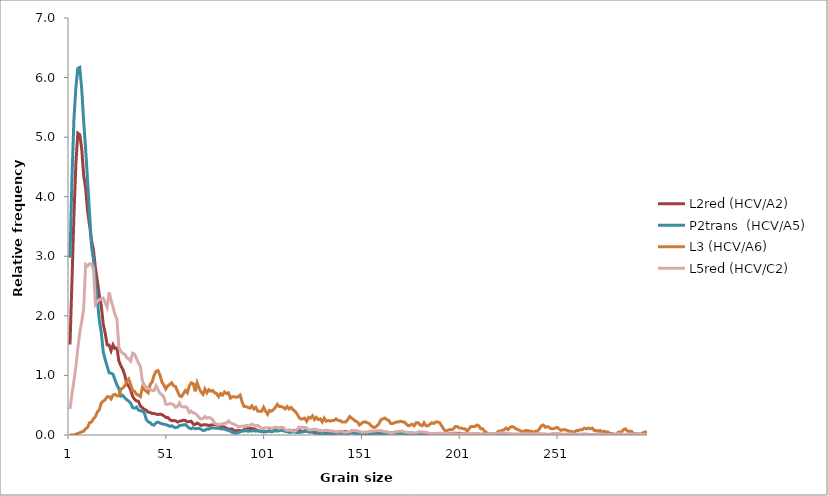
| Category | L2red (HCV/A2)  | P2trans  (HCV/A5) | L3 (HCV/A6) | L5red (HCV/C2) |
|---|---|---|---|---|
| 0 | 1.518 | 2.975 | 0 | 0.437 |
| 1 | 2.56 | 4.295 | 0 | 0.682 |
| 2 | 3.662 | 5.286 | 0 | 0.905 |
| 3 | 4.538 | 5.826 | 0.013 | 1.142 |
| 4 | 5.067 | 6.153 | 0.026 | 1.448 |
| 5 | 5.041 | 6.171 | 0.039 | 1.725 |
| 6 | 4.807 | 5.804 | 0.052 | 1.906 |
| 7 | 4.36 | 5.264 | 0.064 | 2.118 |
| 8 | 4.143 | 4.803 | 0.103 | 2.863 |
| 9 | 3.761 | 4.27 | 0.129 | 2.839 |
| 10 | 3.523 | 3.722 | 0.206 | 2.873 |
| 11 | 3.271 | 3.174 | 0.219 | 2.873 |
| 12 | 3.106 | 2.942 | 0.27 | 2.79 |
| 13 | 2.807 | 2.536 | 0.309 | 2.199 |
| 14 | 2.581 | 2.264 | 0.386 | 2.248 |
| 15 | 2.343 | 1.923 | 0.425 | 2.264 |
| 16 | 2.169 | 1.72 | 0.541 | 2.285 |
| 17 | 1.861 | 1.397 | 0.567 | 2.298 |
| 18 | 1.709 | 1.266 | 0.592 | 2.22 |
| 19 | 1.514 | 1.154 | 0.644 | 2.144 |
| 20 | 1.51 | 1.045 | 0.644 | 2.392 |
| 21 | 1.414 | 1.038 | 0.605 | 2.254 |
| 22 | 1.514 | 1.019 | 0.67 | 2.152 |
| 23 | 1.453 | 0.929 | 0.683 | 2.024 |
| 24 | 1.462 | 0.838 | 0.657 | 1.948 |
| 25 | 1.241 | 0.78 | 0.657 | 1.472 |
| 26 | 1.163 | 0.653 | 0.773 | 1.404 |
| 27 | 1.102 | 0.664 | 0.786 | 1.37 |
| 28 | 1.007 | 0.624 | 0.824 | 1.357 |
| 29 | 0.863 | 0.591 | 0.901 | 1.299 |
| 30 | 0.82 | 0.57 | 0.94 | 1.281 |
| 31 | 0.759 | 0.537 | 0.85 | 1.242 |
| 32 | 0.651 | 0.461 | 0.747 | 1.373 |
| 33 | 0.599 | 0.45 | 0.734 | 1.357 |
| 34 | 0.573 | 0.468 | 0.683 | 1.286 |
| 35 | 0.564 | 0.421 | 0.67 | 1.208 |
| 36 | 0.486 | 0.406 | 0.644 | 1.15 |
| 37 | 0.46 | 0.403 | 0.798 | 0.912 |
| 38 | 0.43 | 0.374 | 0.76 | 0.831 |
| 39 | 0.416 | 0.261 | 0.734 | 0.803 |
| 40 | 0.382 | 0.221 | 0.708 | 0.784 |
| 41 | 0.377 | 0.207 | 0.85 | 0.766 |
| 42 | 0.36 | 0.174 | 0.889 | 0.748 |
| 43 | 0.36 | 0.167 | 1.005 | 0.745 |
| 44 | 0.351 | 0.203 | 1.069 | 0.824 |
| 45 | 0.343 | 0.218 | 1.082 | 0.763 |
| 46 | 0.351 | 0.2 | 1.005 | 0.701 |
| 47 | 0.343 | 0.189 | 0.889 | 0.677 |
| 48 | 0.321 | 0.181 | 0.837 | 0.635 |
| 49 | 0.295 | 0.174 | 0.773 | 0.515 |
| 50 | 0.295 | 0.163 | 0.824 | 0.512 |
| 51 | 0.26 | 0.145 | 0.85 | 0.528 |
| 52 | 0.239 | 0.156 | 0.876 | 0.523 |
| 53 | 0.243 | 0.134 | 0.824 | 0.507 |
| 54 | 0.239 | 0.123 | 0.811 | 0.465 |
| 55 | 0.217 | 0.131 | 0.734 | 0.484 |
| 56 | 0.23 | 0.16 | 0.657 | 0.536 |
| 57 | 0.239 | 0.163 | 0.644 | 0.476 |
| 58 | 0.247 | 0.171 | 0.695 | 0.471 |
| 59 | 0.243 | 0.174 | 0.747 | 0.473 |
| 60 | 0.221 | 0.145 | 0.708 | 0.455 |
| 61 | 0.226 | 0.116 | 0.824 | 0.376 |
| 62 | 0.23 | 0.105 | 0.876 | 0.4 |
| 63 | 0.182 | 0.123 | 0.863 | 0.371 |
| 64 | 0.178 | 0.105 | 0.734 | 0.363 |
| 65 | 0.2 | 0.109 | 0.876 | 0.335 |
| 66 | 0.182 | 0.112 | 0.786 | 0.293 |
| 67 | 0.161 | 0.094 | 0.721 | 0.269 |
| 68 | 0.169 | 0.076 | 0.683 | 0.277 |
| 69 | 0.174 | 0.08 | 0.773 | 0.311 |
| 70 | 0.169 | 0.102 | 0.708 | 0.282 |
| 71 | 0.156 | 0.098 | 0.76 | 0.293 |
| 72 | 0.169 | 0.116 | 0.734 | 0.282 |
| 73 | 0.169 | 0.116 | 0.747 | 0.254 |
| 74 | 0.178 | 0.116 | 0.708 | 0.193 |
| 75 | 0.169 | 0.112 | 0.695 | 0.186 |
| 76 | 0.161 | 0.112 | 0.644 | 0.167 |
| 77 | 0.139 | 0.105 | 0.695 | 0.183 |
| 78 | 0.139 | 0.102 | 0.67 | 0.186 |
| 79 | 0.134 | 0.098 | 0.721 | 0.199 |
| 80 | 0.113 | 0.083 | 0.695 | 0.199 |
| 81 | 0.1 | 0.08 | 0.708 | 0.235 |
| 82 | 0.1 | 0.062 | 0.618 | 0.207 |
| 83 | 0.1 | 0.044 | 0.644 | 0.193 |
| 84 | 0.074 | 0.036 | 0.644 | 0.178 |
| 85 | 0.069 | 0.029 | 0.631 | 0.165 |
| 86 | 0.078 | 0.04 | 0.644 | 0.136 |
| 87 | 0.074 | 0.054 | 0.67 | 0.144 |
| 88 | 0.069 | 0.069 | 0.554 | 0.146 |
| 89 | 0.091 | 0.065 | 0.476 | 0.144 |
| 90 | 0.1 | 0.08 | 0.476 | 0.165 |
| 91 | 0.113 | 0.062 | 0.464 | 0.152 |
| 92 | 0.108 | 0.069 | 0.451 | 0.159 |
| 93 | 0.108 | 0.065 | 0.489 | 0.183 |
| 94 | 0.104 | 0.076 | 0.438 | 0.167 |
| 95 | 0.091 | 0.065 | 0.464 | 0.152 |
| 96 | 0.074 | 0.073 | 0.399 | 0.159 |
| 97 | 0.065 | 0.062 | 0.399 | 0.139 |
| 98 | 0.056 | 0.062 | 0.399 | 0.112 |
| 99 | 0.052 | 0.054 | 0.464 | 0.107 |
| 100 | 0.056 | 0.054 | 0.399 | 0.123 |
| 101 | 0.061 | 0.058 | 0.348 | 0.12 |
| 102 | 0.074 | 0.065 | 0.412 | 0.123 |
| 103 | 0.078 | 0.054 | 0.399 | 0.105 |
| 104 | 0.087 | 0.062 | 0.425 | 0.12 |
| 105 | 0.108 | 0.073 | 0.464 | 0.133 |
| 106 | 0.113 | 0.065 | 0.515 | 0.12 |
| 107 | 0.113 | 0.073 | 0.476 | 0.112 |
| 108 | 0.121 | 0.08 | 0.476 | 0.123 |
| 109 | 0.1 | 0.073 | 0.464 | 0.125 |
| 110 | 0.074 | 0.058 | 0.438 | 0.089 |
| 111 | 0.069 | 0.058 | 0.476 | 0.078 |
| 112 | 0.082 | 0.044 | 0.438 | 0.081 |
| 113 | 0.065 | 0.047 | 0.464 | 0.078 |
| 114 | 0.074 | 0.051 | 0.425 | 0.068 |
| 115 | 0.078 | 0.051 | 0.399 | 0.068 |
| 116 | 0.069 | 0.044 | 0.361 | 0.086 |
| 117 | 0.069 | 0.04 | 0.296 | 0.131 |
| 118 | 0.069 | 0.047 | 0.27 | 0.131 |
| 119 | 0.056 | 0.051 | 0.27 | 0.125 |
| 120 | 0.069 | 0.058 | 0.283 | 0.128 |
| 121 | 0.069 | 0.062 | 0.232 | 0.12 |
| 122 | 0.052 | 0.065 | 0.296 | 0.086 |
| 123 | 0.048 | 0.058 | 0.283 | 0.086 |
| 124 | 0.052 | 0.054 | 0.322 | 0.092 |
| 125 | 0.035 | 0.054 | 0.258 | 0.097 |
| 126 | 0.035 | 0.051 | 0.296 | 0.094 |
| 127 | 0.026 | 0.04 | 0.258 | 0.078 |
| 128 | 0.035 | 0.029 | 0.27 | 0.081 |
| 129 | 0.026 | 0.025 | 0.219 | 0.068 |
| 130 | 0.03 | 0.015 | 0.283 | 0.076 |
| 131 | 0.03 | 0.022 | 0.232 | 0.081 |
| 132 | 0.026 | 0.033 | 0.245 | 0.078 |
| 133 | 0.022 | 0.036 | 0.232 | 0.065 |
| 134 | 0.03 | 0.04 | 0.245 | 0.073 |
| 135 | 0.026 | 0.04 | 0.245 | 0.06 |
| 136 | 0.03 | 0.04 | 0.27 | 0.055 |
| 137 | 0.048 | 0.033 | 0.245 | 0.055 |
| 138 | 0.052 | 0.033 | 0.245 | 0.065 |
| 139 | 0.052 | 0.025 | 0.219 | 0.055 |
| 140 | 0.056 | 0.029 | 0.219 | 0.05 |
| 141 | 0.061 | 0.025 | 0.219 | 0.044 |
| 142 | 0.043 | 0.025 | 0.258 | 0.055 |
| 143 | 0.043 | 0.029 | 0.309 | 0.052 |
| 144 | 0.048 | 0.033 | 0.283 | 0.076 |
| 145 | 0.043 | 0.033 | 0.258 | 0.076 |
| 146 | 0.03 | 0.033 | 0.232 | 0.073 |
| 147 | 0.039 | 0.029 | 0.219 | 0.065 |
| 148 | 0.03 | 0.025 | 0.167 | 0.06 |
| 149 | 0.026 | 0.029 | 0.193 | 0.05 |
| 150 | 0.022 | 0.029 | 0.219 | 0.044 |
| 151 | 0.026 | 0.029 | 0.219 | 0.052 |
| 152 | 0.022 | 0.044 | 0.206 | 0.047 |
| 153 | 0.026 | 0.04 | 0.193 | 0.063 |
| 154 | 0.026 | 0.033 | 0.155 | 0.058 |
| 155 | 0.035 | 0.025 | 0.129 | 0.068 |
| 156 | 0.035 | 0.022 | 0.129 | 0.068 |
| 157 | 0.043 | 0.007 | 0.155 | 0.073 |
| 158 | 0.052 | 0.015 | 0.193 | 0.071 |
| 159 | 0.048 | 0.025 | 0.258 | 0.073 |
| 160 | 0.048 | 0.025 | 0.27 | 0.065 |
| 161 | 0.043 | 0.022 | 0.283 | 0.055 |
| 162 | 0.043 | 0.022 | 0.258 | 0.055 |
| 163 | 0.035 | 0.022 | 0.245 | 0.037 |
| 164 | 0.035 | 0.018 | 0.193 | 0.029 |
| 165 | 0.035 | 0.025 | 0.193 | 0.026 |
| 166 | 0.039 | 0.025 | 0.206 | 0.055 |
| 167 | 0.039 | 0.033 | 0.219 | 0.055 |
| 168 | 0.035 | 0.029 | 0.219 | 0.063 |
| 169 | 0.039 | 0.029 | 0.232 | 0.063 |
| 170 | 0.035 | 0.025 | 0.219 | 0.068 |
| 171 | 0.03 | 0.029 | 0.219 | 0.05 |
| 172 | 0.017 | 0.029 | 0.18 | 0.047 |
| 173 | 0.017 | 0.025 | 0.155 | 0.039 |
| 174 | 0.013 | 0.022 | 0.167 | 0.042 |
| 175 | 0.017 | 0.025 | 0.18 | 0.042 |
| 176 | 0.022 | 0.022 | 0.155 | 0.034 |
| 177 | 0.022 | 0.022 | 0.206 | 0.037 |
| 178 | 0.026 | 0.025 | 0.206 | 0.05 |
| 179 | 0.026 | 0.022 | 0.167 | 0.055 |
| 180 | 0.022 | 0.015 | 0.155 | 0.05 |
| 181 | 0.017 | 0.022 | 0.206 | 0.047 |
| 182 | 0.026 | 0.015 | 0.155 | 0.047 |
| 183 | 0.017 | 0.015 | 0.155 | 0.037 |
| 184 | 0.017 | 0.011 | 0.18 | 0.024 |
| 185 | 0.013 | 0.015 | 0.206 | 0.024 |
| 186 | 0.013 | 0.011 | 0.193 | 0.024 |
| 187 | 0.004 | 0.011 | 0.219 | 0.024 |
| 188 | 0.009 | 0.015 | 0.219 | 0.029 |
| 189 | 0.004 | 0.015 | 0.206 | 0.029 |
| 190 | 0.004 | 0.015 | 0.155 | 0.029 |
| 191 | 0.004 | 0.015 | 0.103 | 0.029 |
| 192 | 0.009 | 0.018 | 0.064 | 0.026 |
| 193 | 0.013 | 0.011 | 0.077 | 0.018 |
| 194 | 0.017 | 0.011 | 0.09 | 0.021 |
| 195 | 0.022 | 0.011 | 0.09 | 0.018 |
| 196 | 0.03 | 0.007 | 0.103 | 0.024 |
| 197 | 0.03 | 0.004 | 0.142 | 0.021 |
| 198 | 0.026 | 0.004 | 0.142 | 0.018 |
| 199 | 0.03 | 0.004 | 0.116 | 0.018 |
| 200 | 0.026 | 0 | 0.116 | 0.021 |
| 201 | 0.017 | 0 | 0.103 | 0.016 |
| 202 | 0.017 | 0.007 | 0.103 | 0.013 |
| 203 | 0.013 | 0.007 | 0.064 | 0.021 |
| 204 | 0.004 | 0.007 | 0.103 | 0.021 |
| 205 | 0.013 | 0.011 | 0.142 | 0.026 |
| 206 | 0.013 | 0.011 | 0.142 | 0.026 |
| 207 | 0.013 | 0.004 | 0.142 | 0.024 |
| 208 | 0.017 | 0.007 | 0.167 | 0.018 |
| 209 | 0.017 | 0.007 | 0.155 | 0.016 |
| 210 | 0.009 | 0.011 | 0.103 | 0.005 |
| 211 | 0.013 | 0.011 | 0.103 | 0.008 |
| 212 | 0.009 | 0.015 | 0.064 | 0.01 |
| 213 | 0.004 | 0.011 | 0.039 | 0.016 |
| 214 | 0.009 | 0.018 | 0.013 | 0.016 |
| 215 | 0.013 | 0.011 | 0.013 | 0.024 |
| 216 | 0.013 | 0.015 | 0.013 | 0.024 |
| 217 | 0.013 | 0.011 | 0.026 | 0.024 |
| 218 | 0.013 | 0.011 | 0.026 | 0.018 |
| 219 | 0.009 | 0.004 | 0.064 | 0.034 |
| 220 | 0.009 | 0.004 | 0.064 | 0.034 |
| 221 | 0.004 | 0.004 | 0.077 | 0.031 |
| 222 | 0.004 | 0.004 | 0.09 | 0.031 |
| 223 | 0.009 | 0.004 | 0.116 | 0.034 |
| 224 | 0.009 | 0.007 | 0.09 | 0.026 |
| 225 | 0.004 | 0.007 | 0.129 | 0.021 |
| 226 | 0.004 | 0.004 | 0.142 | 0.018 |
| 227 | 0.004 | 0.011 | 0.129 | 0.016 |
| 228 | 0.004 | 0.011 | 0.103 | 0.013 |
| 229 | 0.004 | 0.007 | 0.09 | 0.016 |
| 230 | 0.009 | 0.011 | 0.077 | 0.016 |
| 231 | 0.022 | 0.011 | 0.052 | 0.021 |
| 232 | 0.022 | 0.011 | 0.064 | 0.021 |
| 233 | 0.017 | 0.015 | 0.077 | 0.026 |
| 234 | 0.017 | 0.015 | 0.077 | 0.018 |
| 235 | 0.017 | 0.011 | 0.064 | 0.021 |
| 236 | 0.009 | 0.011 | 0.064 | 0.016 |
| 237 | 0.009 | 0.004 | 0.039 | 0.024 |
| 238 | 0.009 | 0 | 0.064 | 0.021 |
| 239 | 0.009 | 0 | 0.064 | 0.024 |
| 240 | 0.004 | 0 | 0.103 | 0.018 |
| 241 | 0 | 0 | 0.155 | 0.024 |
| 242 | 0 | 0.004 | 0.167 | 0.016 |
| 243 | 0 | 0.004 | 0.129 | 0.018 |
| 244 | 0 | 0.007 | 0.142 | 0.013 |
| 245 | 0.004 | 0.007 | 0.129 | 0.013 |
| 246 | 0.004 | 0.007 | 0.103 | 0.021 |
| 247 | 0.004 | 0.007 | 0.103 | 0.026 |
| 248 | 0.004 | 0.007 | 0.116 | 0.024 |
| 249 | 0.004 | 0.007 | 0.129 | 0.024 |
| 250 | 0.004 | 0.007 | 0.103 | 0.024 |
| 251 | 0.004 | 0.007 | 0.077 | 0.016 |
| 252 | 0.004 | 0.004 | 0.09 | 0.016 |
| 253 | 0.004 | 0.004 | 0.09 | 0.013 |
| 254 | 0.004 | 0 | 0.077 | 0.013 |
| 255 | 0.004 | 0 | 0.064 | 0.018 |
| 256 | 0.009 | 0 | 0.064 | 0.016 |
| 257 | 0.009 | 0 | 0.052 | 0.016 |
| 258 | 0.009 | 0 | 0.052 | 0.013 |
| 259 | 0.009 | 0 | 0.077 | 0.016 |
| 260 | 0.004 | 0 | 0.077 | 0.016 |
| 261 | 0 | 0.004 | 0.09 | 0.016 |
| 262 | 0.004 | 0.011 | 0.09 | 0.01 |
| 263 | 0.004 | 0.011 | 0.116 | 0.013 |
| 264 | 0.009 | 0.011 | 0.103 | 0.013 |
| 265 | 0.009 | 0.011 | 0.116 | 0.008 |
| 266 | 0.009 | 0.007 | 0.103 | 0.005 |
| 267 | 0.004 | 0.007 | 0.116 | 0.008 |
| 268 | 0.009 | 0.011 | 0.077 | 0.008 |
| 269 | 0.004 | 0.011 | 0.077 | 0.008 |
| 270 | 0.004 | 0.011 | 0.064 | 0.01 |
| 271 | 0.009 | 0.011 | 0.077 | 0.013 |
| 272 | 0.009 | 0.004 | 0.052 | 0.013 |
| 273 | 0.009 | 0 | 0.064 | 0.01 |
| 274 | 0.009 | 0 | 0.052 | 0.01 |
| 275 | 0.009 | 0 | 0.052 | 0.01 |
| 276 | 0.004 | 0 | 0.026 | 0.008 |
| 277 | 0.004 | 0 | 0.026 | 0.008 |
| 278 | 0 | 0.007 | 0.013 | 0.016 |
| 279 | 0 | 0.007 | 0 | 0.018 |
| 280 | 0.004 | 0.007 | 0.039 | 0.021 |
| 281 | 0.009 | 0.007 | 0.052 | 0.021 |
| 282 | 0.009 | 0.007 | 0.052 | 0.018 |
| 283 | 0.009 | 0.004 | 0.09 | 0.01 |
| 284 | 0.009 | 0.004 | 0.103 | 0.01 |
| 285 | 0.009 | 0.004 | 0.064 | 0.008 |
| 286 | 0.004 | 0.004 | 0.064 | 0.008 |
| 287 | 0.009 | 0.007 | 0.064 | 0.013 |
| 288 | 0.017 | 0.007 | 0.026 | 0.018 |
| 289 | 0.017 | 0.007 | 0.013 | 0.013 |
| 290 | 0.013 | 0.011 | 0.013 | 0.01 |
| 291 | 0.013 | 0.011 | 0.013 | 0.013 |
| 292 | 0.009 | 0.007 | 0.013 | 0.01 |
| 293 | 0.004 | 0.004 | 0.039 | 0.01 |
| 294 | 0.004 | 0.004 | 0.052 | 0.01 |
| 295 | 0.004 | 0 | 0.052 | 0.01 |